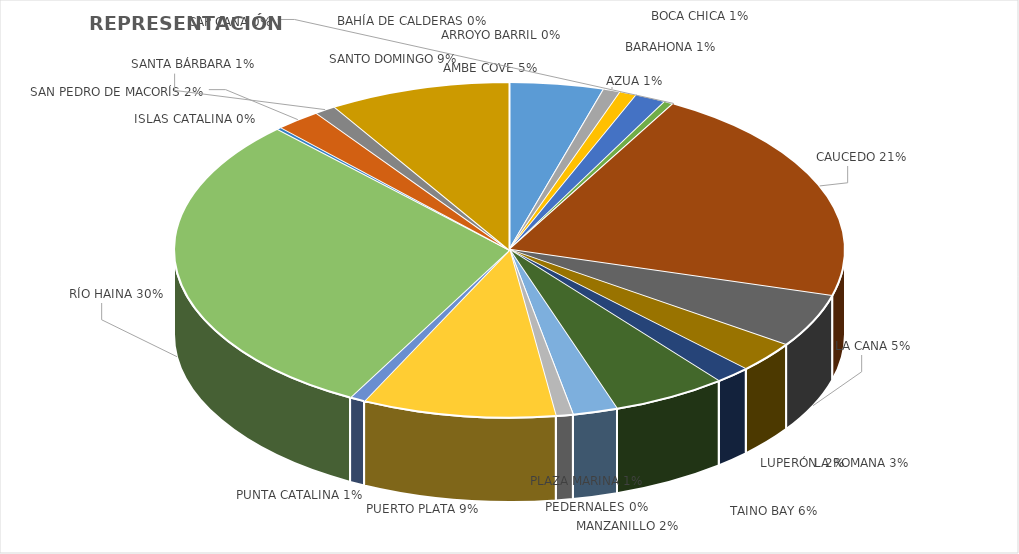
| Category | Series 0 |
|---|---|
| AMBE COVE | 0.046 |
| ARROYO BARRIL | 0 |
| AZUA | 0.008 |
| BARAHONA | 0.008 |
| BOCA CHICA | 0.015 |
| BAHÍA DE CALDERAS | 0.004 |
| CAP CANA | 0 |
| CAUCEDO | 0.213 |
| LA CANA | 0.052 |
| LA ROMANA | 0.03 |
| LUPERÓN  | 0.017 |
| TAINO BAY | 0.055 |
| MANZANILLO | 0.022 |
| PEDERNALES | 0 |
| PLAZA MARINA | 0.008 |
| PUERTO PLATA | 0.093 |
| PUNTA CATALINA | 0.007 |
| RÍO HAINA | 0.299 |
| ISLAS CATALINA | 0.002 |
| SAN PEDRO DE MACORÍS | 0.022 |
| SANTA BÁRBARA | 0.01 |
| SANTO DOMINGO | 0.087 |